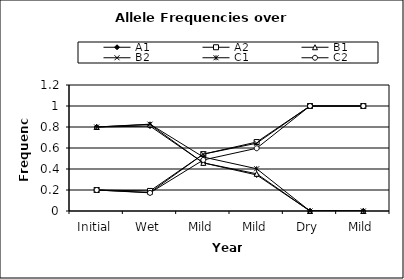
| Category | A1 | A2 | B1 | B2 | C1 | C2 |
|---|---|---|---|---|---|---|
| Initial | 0.8 | 0.2 | 0.8 | 0.2 | 0.8 | 0.2 |
| Wet | 0.809 | 0.191 | 0.824 | 0.176 | 0.827 | 0.173 |
| Mild | 0.458 | 0.542 | 0.458 | 0.542 | 0.514 | 0.486 |
| Mild | 0.343 | 0.657 | 0.354 | 0.646 | 0.402 | 0.598 |
| Dry | 0 | 1 | 0 | 1 | 0 | 1 |
| Mild | 0 | 1 | 0 | 1 | 0 | 1 |